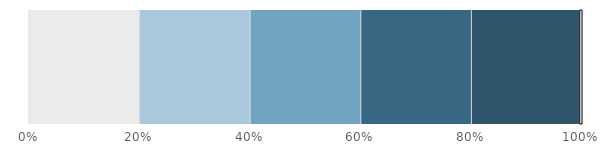
| Category | Series 0 | Series 1 |
|---|---|---|
| 0 | 0.995 | 0.01 |